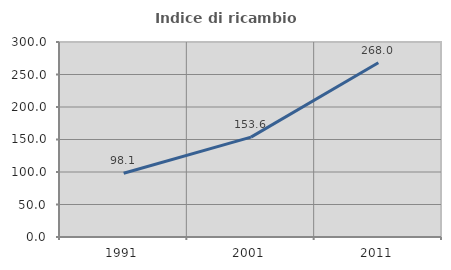
| Category | Indice di ricambio occupazionale  |
|---|---|
| 1991.0 | 98.062 |
| 2001.0 | 153.604 |
| 2011.0 | 267.993 |